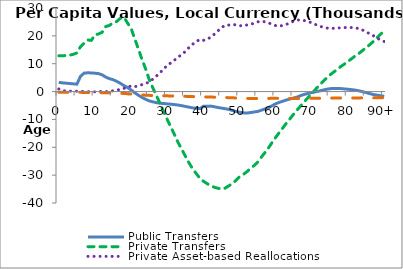
| Category | Public Transfers | Private Transfers | Private Asset-based Reallocations | Public Asset-based Reallocations |
|---|---|---|---|---|
| 0 | 3288.152 | 12833.232 | 919.654 | -244.097 |
|  | 3127.999 | 12878.76 | 309.06 | -245.799 |
| 2 | 3012.938 | 12924.289 | 231.226 | -247.502 |
| 3 | 2895.119 | 13067.099 | 170.311 | -251.162 |
| 4 | 2772.068 | 13363.144 | 135.425 | -258.133 |
| 5 | 2652.371 | 13856.395 | 127.417 | -269.168 |
| 6 | 5460.452 | 16130.808 | 139.553 | -284.146 |
| 7 | 6621.364 | 17332.071 | 3.243 | -301.201 |
| 8 | 6733.618 | 18514.471 | -44.646 | -319.515 |
| 9 | 6695.511 | 18389.171 | 11.506 | -338.793 |
| 10 | 6592.659 | 20358.018 | -98.522 | -359.058 |
| 11 | 6440.609 | 20683.687 | 36.644 | -379.127 |
| 12 | 6008.589 | 21311.313 | 53.61 | -400.767 |
| 13 | 5169.026 | 23363.104 | -57.453 | -424.414 |
| 14 | 4633.588 | 23733.075 | 174.178 | -449.909 |
| 15 | 4272.172 | 24716.393 | 260.189 | -494.859 |
| 16 | 3681.24 | 25147.573 | 381.058 | -539.032 |
| 17 | 2996.91 | 26308.986 | 903.818 | -605.102 |
| 18 | 2145.843 | 26730.318 | 1117.145 | -677.201 |
| 19 | 1463.068 | 24610.339 | 1635.567 | -764.279 |
| 20 | 582.965 | 22672.841 | 2012.101 | -865.344 |
| 21 | -435.875 | 18976.604 | 1766.945 | -990.342 |
| 22 | -1295.514 | 15313.089 | 2007.421 | -1099.402 |
| 23 | -2097.816 | 11585.974 | 2479.601 | -1201.873 |
| 24 | -2767.074 | 8202.589 | 2900.446 | -1294.951 |
| 25 | -3337.99 | 4394.022 | 3422.411 | -1363.005 |
| 26 | -3689.755 | 1346.778 | 4455.866 | -1421.183 |
| 27 | -3970.595 | -1459.669 | 5577.212 | -1463.666 |
| 28 | -4201.84 | -4298.677 | 6778.356 | -1500.717 |
| 29 | -4298.91 | -7213.833 | 8133.933 | -1518.114 |
| 30 | -4419.779 | -10034.403 | 9401.906 | -1539.417 |
| 31 | -4531.694 | -12746.445 | 10320.494 | -1559.101 |
| 32 | -4681.685 | -15491.991 | 11301.524 | -1587.231 |
| 33 | -4840.128 | -18288.573 | 12354.594 | -1617.641 |
| 34 | -5070.082 | -20714.02 | 13311.211 | -1660.443 |
| 35 | -5336.226 | -23171.176 | 14388.097 | -1711.194 |
| 36 | -5596.839 | -25569.927 | 15805.805 | -1760.941 |
| 37 | -5856.694 | -27678.032 | 16975.121 | -1810.173 |
| 38 | -6005.011 | -29416.241 | 17897.549 | -1838.13 |
| 39 | -6130.477 | -31089.842 | 18714.64 | -1862.091 |
| 40 | -5304.019 | -32198.398 | 18405.793 | -1884.803 |
| 41 | -5258.833 | -33012.937 | 18718.34 | -1915.178 |
| 42 | -5220.103 | -33844.34 | 19538.424 | -1956.237 |
| 43 | -5446.898 | -34345.811 | 20574.718 | -2011.441 |
| 44 | -5720.847 | -34697.321 | 21773.879 | -2073.624 |
| 45 | -5938.384 | -34989.831 | 22963.792 | -2119.442 |
| 46 | -6153.016 | -34671.573 | 23790.668 | -2157.399 |
| 47 | -6380.435 | -33857.291 | 23866.365 | -2181.539 |
| 48 | -6785.219 | -33053.371 | 24123.371 | -2241.468 |
| 49 | -7117.134 | -31840.257 | 23920.327 | -2289.323 |
| 50 | -7415.954 | -30546.243 | 23652.335 | -2346.696 |
| 51 | -7642.909 | -29772.727 | 23611.59 | -2401.104 |
| 52 | -7737.042 | -28801.038 | 23903.323 | -2450.422 |
| 53 | -7528.839 | -27664.28 | 24047.877 | -2463.77 |
| 54 | -7331.578 | -26595.161 | 24576.379 | -2475.234 |
| 55 | -7138.184 | -25360.608 | 25004.611 | -2479.182 |
| 56 | -6703.159 | -23594.981 | 25221.182 | -2473.259 |
| 57 | -6234.432 | -21924.266 | 25053.712 | -2463.538 |
| 58 | -5728.945 | -20207.714 | 24725.704 | -2450.45 |
| 59 | -5090.901 | -18272.086 | 24044.6 | -2432.888 |
| 60 | -4379.982 | -16410.575 | 23671.489 | -2421.549 |
| 61 | -3853.01 | -14691.675 | 23502.828 | -2417.92 |
| 62 | -3424.708 | -12993.695 | 23736.298 | -2433.276 |
| 63 | -3008.093 | -11252.12 | 24126.026 | -2448.646 |
| 64 | -2633.518 | -9659.351 | 24809.917 | -2469.688 |
| 65 | -2292.096 | -8050.268 | 25243.158 | -2480.94 |
| 66 | -1948.014 | -6509.401 | 25715.084 | -2490.713 |
| 67 | -1394.699 | -4949.97 | 25642.807 | -2457.341 |
| 68 | -965.788 | -3511.801 | 25467.089 | -2440.783 |
| 69 | -667.69 | -2057.492 | 25081.592 | -2431.557 |
| 70 | -361.664 | -677.69 | 24696.295 | -2424.817 |
| 71 | -93.221 | 786.724 | 24078.865 | -2423.523 |
| 72 | 179.459 | 2197.345 | 23520.421 | -2419.821 |
| 73 | 501.612 | 3513.279 | 23147.395 | -2394.957 |
| 74 | 822.423 | 4777.532 | 22852.737 | -2371.275 |
| 75 | 1033.264 | 5982.282 | 22585.611 | -2351.04 |
| 76 | 1131.954 | 6973.161 | 22711.254 | -2332.378 |
| 77 | 1135.202 | 7954.987 | 22856.682 | -2316.1 |
| 78 | 1072.956 | 8972.391 | 22843.723 | -2311.929 |
| 79 | 951.437 | 9867.352 | 22940.477 | -2306.133 |
| 80 | 834.442 | 10835.329 | 23067.266 | -2296.022 |
| 81 | 691.392 | 11826.901 | 22970.326 | -2285.509 |
| 82 | 511.142 | 12800.474 | 22823.492 | -2275.307 |
| 83 | 273.123 | 13682.953 | 22637.27 | -2266.606 |
| 84 | -20.55 | 14719.934 | 22108.515 | -2260.546 |
| 85 | -360.651 | 15753.584 | 21411.068 | -2256.523 |
| 86 | -722.593 | 16835.385 | 20755.29 | -2250.418 |
| 87 | -1060.235 | 17989.519 | 20045.441 | -2242.065 |
| 88 | -1266.14 | 19317.113 | 19169.843 | -2230.121 |
| 89 | -1475.388 | 20569.405 | 18573.724 | -2215.271 |
| 90+ | -1695.529 | 21821.696 | 17990.459 | -2202.383 |